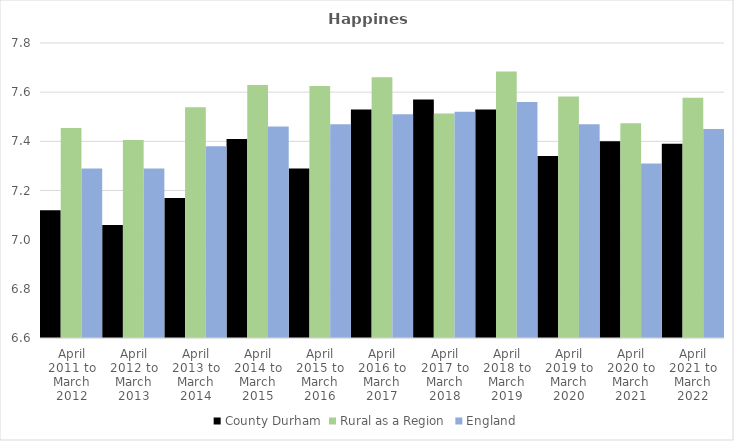
| Category | County Durham | Rural as a Region | England |
|---|---|---|---|
| April 2011 to March 2012 | 7.12 | 7.454 | 7.29 |
| April 2012 to March 2013 | 7.06 | 7.406 | 7.29 |
| April 2013 to March 2014 | 7.17 | 7.539 | 7.38 |
| April 2014 to March 2015 | 7.41 | 7.63 | 7.46 |
| April 2015 to March 2016 | 7.29 | 7.625 | 7.47 |
| April 2016 to March 2017 | 7.53 | 7.661 | 7.51 |
| April 2017 to March 2018 | 7.57 | 7.513 | 7.52 |
| April 2018 to March 2019 | 7.53 | 7.684 | 7.56 |
| April 2019 to March 2020 | 7.34 | 7.582 | 7.47 |
| April 2020 to March 2021 | 7.4 | 7.474 | 7.31 |
| April 2021 to March 2022 | 7.39 | 7.577 | 7.45 |